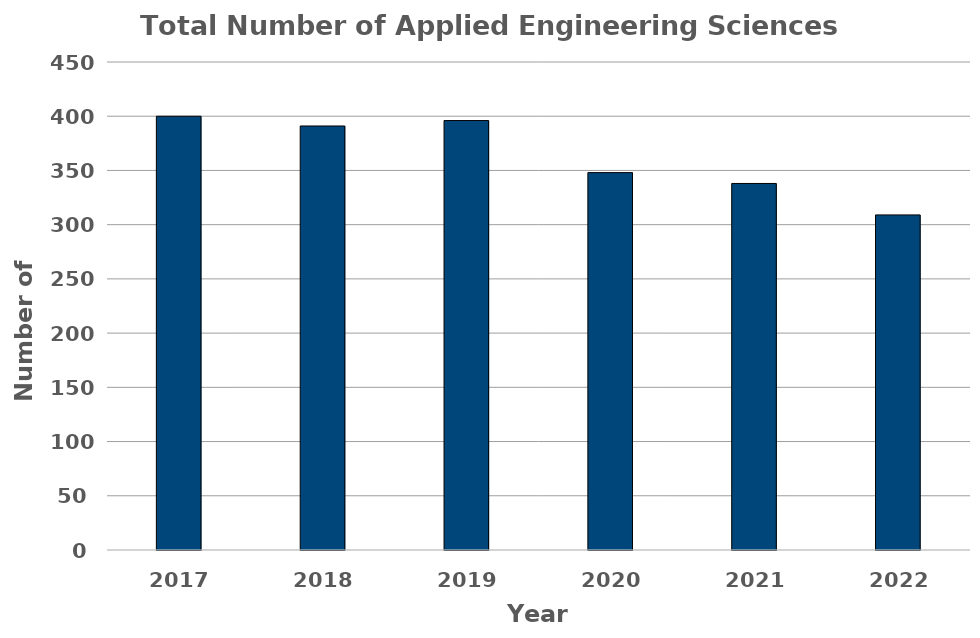
| Category | Total Number of Computer Science Students+CSEData!$D$5:$D$10 |
|---|---|
| 2017.0 | 400 |
| 2018.0 | 391 |
| 2019.0 | 396 |
| 2020.0 | 348 |
| 2021.0 | 338 |
| 2022.0 | 309 |